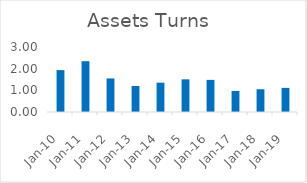
| Category | Net Fixed Assets Turns (Higher is better) |
|---|---|
| 2010-03-31 | 1.934 |
| 2011-03-31 | 2.344 |
| 2012-03-31 | 1.549 |
| 2013-03-31 | 1.201 |
| 2014-03-31 | 1.353 |
| 2015-03-31 | 1.506 |
| 2016-03-31 | 1.482 |
| 2017-03-31 | 0.972 |
| 2018-03-31 | 1.05 |
| 2019-03-31 | 1.113 |